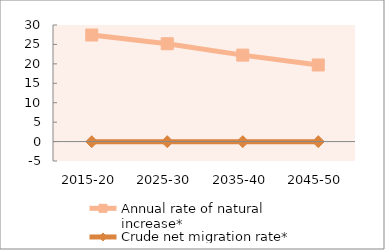
| Category | Annual rate of natural increase* | Crude net migration rate* |
|---|---|---|
| 2015-20 | 27.426 | -0.038 |
| 2025-30 | 25.177 | -0.03 |
| 2035-40 | 22.253 | -0.023 |
| 2045-50 | 19.713 | -0.019 |